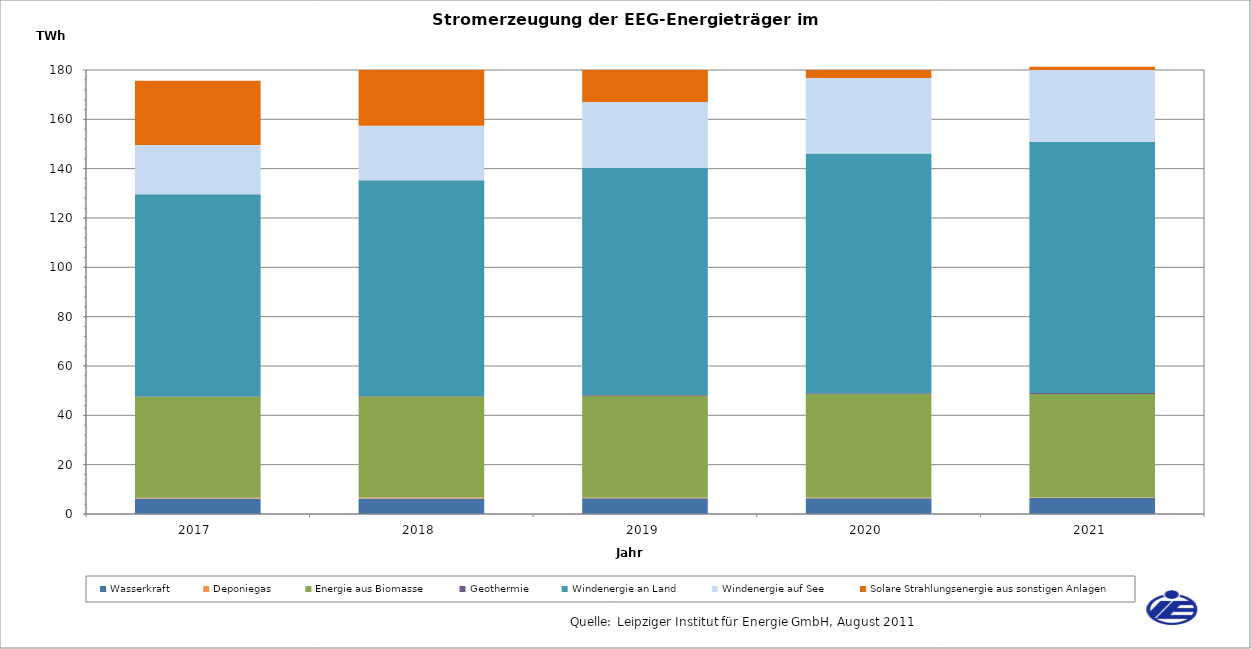
| Category | Wasserkraft | Deponiegas | Energie aus Biomasse | Geothermie | Windenergie an Land | Windenergie auf See | Solare Strahlungsenergie aus sonstigen Anlagen |
|---|---|---|---|---|---|---|---|
| 2017.0 | 6280.817 | 352.623 | 40770.393 | 189.524 | 82001.903 | 20033.355 | 25962.644 |
| 2018.0 | 6312.332 | 333.431 | 40981.485 | 249.571 | 87402.153 | 22114.719 | 26641.196 |
| 2019.0 | 6350.951 | 316.684 | 41311.799 | 286.803 | 92134.6 | 26658.148 | 27384.16 |
| 2020.0 | 6416.459 | 302.281 | 41892.56 | 346.785 | 97197.746 | 30593.451 | 28254.05 |
| 2021.0 | 6440.639 | 286.678 | 41968.793 | 405.643 | 101676.081 | 30565.859 | 29134.453 |